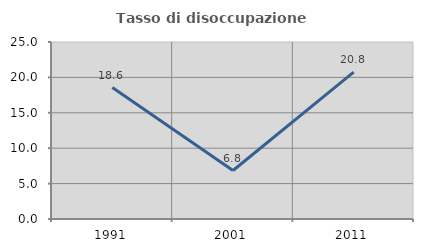
| Category | Tasso di disoccupazione giovanile  |
|---|---|
| 1991.0 | 18.567 |
| 2001.0 | 6.849 |
| 2011.0 | 20.755 |